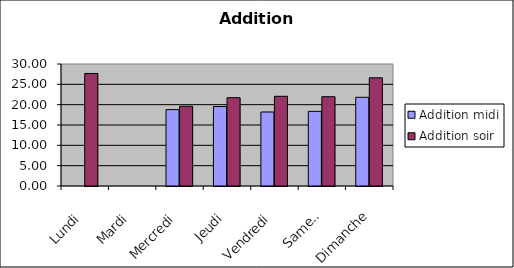
| Category | Addition |
|---|---|
| Lundi | 27.667 |
| Mardi | 0 |
| Mercredi | 19.605 |
| Jeudi | 21.71 |
| Vendredi | 22.056 |
| Samedi | 21.956 |
| Dimanche | 26.605 |